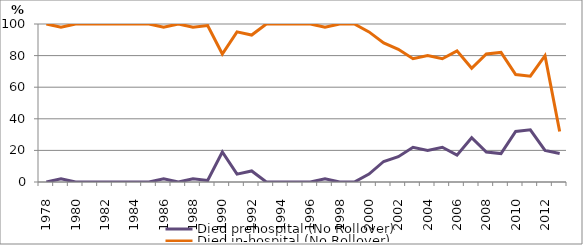
| Category | Died prehospital (No Rollover) | Died in-hospital (No Rollover) |
|---|---|---|
| 1978.0 | 0 | 100 |
| 1979.0 | 2 | 98 |
| 1980.0 | 0 | 100 |
| 1981.0 | 0 | 100 |
| 1982.0 | 0 | 100 |
| 1983.0 | 0 | 100 |
| 1984.0 | 0 | 100 |
| 1985.0 | 0 | 100 |
| 1986.0 | 2 | 98 |
| 1987.0 | 0 | 100 |
| 1988.0 | 2 | 98 |
| 1989.0 | 1 | 99 |
| 1990.0 | 19 | 81 |
| 1991.0 | 5 | 95 |
| 1992.0 | 7 | 93 |
| 1993.0 | 0 | 100 |
| 1994.0 | 0 | 100 |
| 1995.0 | 0 | 100 |
| 1996.0 | 0 | 100 |
| 1997.0 | 2 | 98 |
| 1998.0 | 0 | 100 |
| 1999.0 | 0 | 100 |
| 2000.0 | 5 | 95 |
| 2001.0 | 13 | 88 |
| 2002.0 | 16 | 84 |
| 2003.0 | 22 | 78 |
| 2004.0 | 20 | 80 |
| 2005.0 | 22 | 78 |
| 2006.0 | 17 | 83 |
| 2007.0 | 28 | 72 |
| 2008.0 | 19 | 81 |
| 2009.0 | 18 | 82 |
| 2010.0 | 32 | 68 |
| 2011.0 | 33 | 67 |
| 2012.0 | 20 | 80 |
| 2013.0 | 18 | 32 |